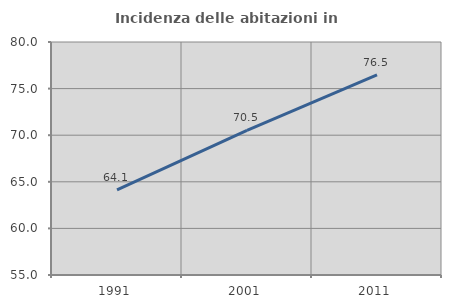
| Category | Incidenza delle abitazioni in proprietà  |
|---|---|
| 1991.0 | 64.137 |
| 2001.0 | 70.508 |
| 2011.0 | 76.482 |